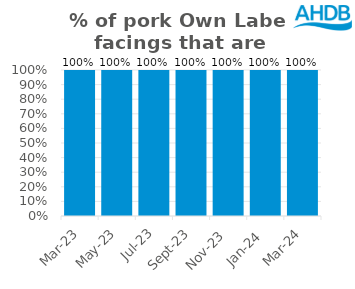
| Category | Series 2 |
|---|---|
| 2023-03-01 | 1 |
| 2023-05-01 | 1 |
| 2023-07-01 | 1 |
| 2023-09-01 | 1 |
| 2023-11-01 | 1 |
| 2024-01-01 | 1 |
| 2024-03-01 | 1 |